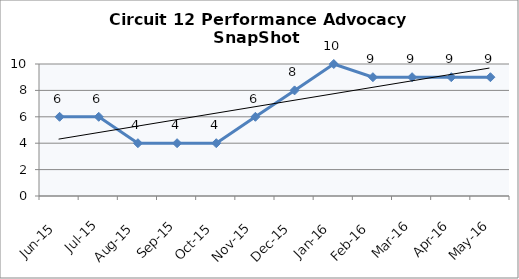
| Category | Circuit 12 |
|---|---|
| Jun-15 | 6 |
| Jul-15 | 6 |
| Aug-15 | 4 |
| Sep-15 | 4 |
| Oct-15 | 4 |
| Nov-15 | 6 |
| Dec-15 | 8 |
| Jan-16 | 10 |
| Feb-16 | 9 |
| Mar-16 | 9 |
| Apr-16 | 9 |
| May-16 | 9 |